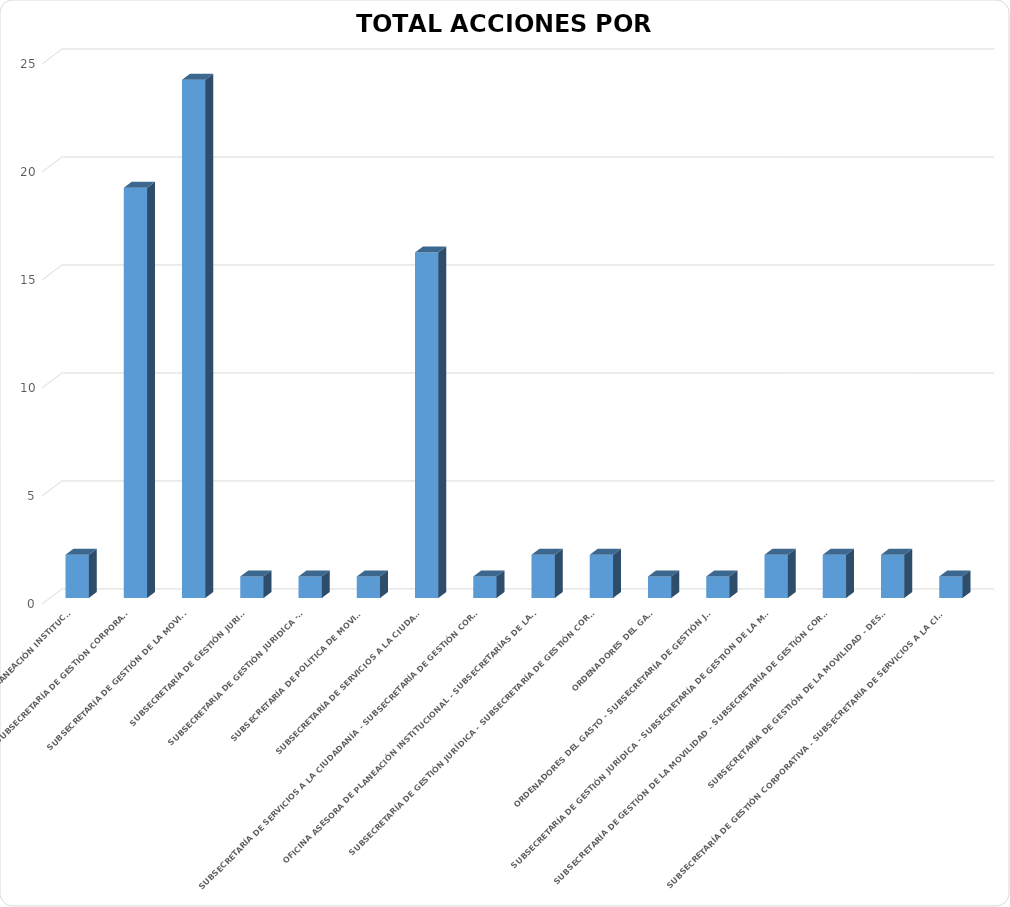
| Category | ABIERTA |
|---|---|
| OFICINA ASESORA DE PLANEACIÓN INSTITUCIONAL | 2 |
| SUBSECRETARÍA DE GESTIÓN CORPORATIVA  | 19 |
| SUBSECRETARÍA DE GESTIÓN DE LA MOVILIDAD | 24 |
| SUBSECRETARÍA DE GESTIÓN JURIDICA | 1 |
| SUBSECRETARÍA DE GESTIÓN JURIDICA - OTIC | 1 |
| SUBSECRETARÍA DE POLÍTICA DE MOVILIDAD | 1 |
| SUBSECRETARÍA DE SERVICIOS A LA CIUDADANÍA | 16 |
| SUBSECRETARÍA DE SERVICIOS A LA CIUDADANÍA - SUBSECRETARÍA DE GESTIÓN CORPORATIVA  | 1 |
| OFICINA ASESORA DE PLANEACIÓN INSTITUCIONAL - SUBSECRETARÍAS DE LA ENTIDAD. | 2 |
| SUBSECRETARÍA DE GESTIÓN JURÍDICA - SUBSECRETARÍA DE GESTIÓN CORPORATIVA | 2 |
| ORDENADORES DEL GASTO | 1 |
| ORDENADORES DEL GASTO - SUBSECRETARÍA DE GESTIÓN JURIDICA | 1 |
| SUBSECRETARÍA DE GESTIÓN JURÍDICA - SUBSECRETARÍA DE GESTIÓN DE LA MOVILIDAD | 2 |
| SUBSECRETARÍA DE GESTIÓN DE LA MOVILIDAD - SUBSECRETARÍA DE GESTIÓN CORPORATIVA  | 2 |
| SUBSECRETARÍA DE GESTIÓN DE LA MOVILIDAD - DESPACHO | 2 |
| SUBSECRETARÍA DE GESTIÓN CORPORATIVA - SUBSECRETARÍA DE SERVICIOS A LA CIUDADANÍA | 1 |